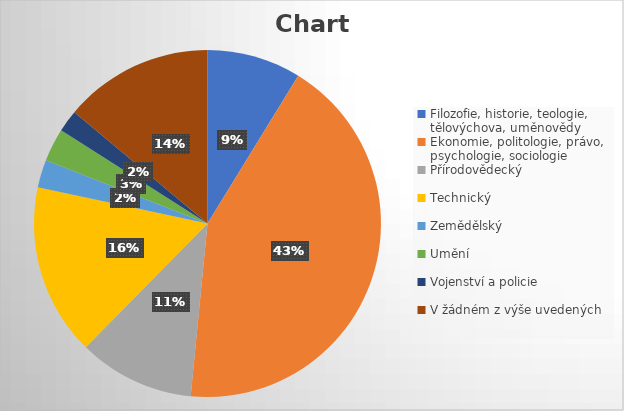
| Category | Series 0 |
|---|---|
| Filozofie, historie, teologie, tělovýchova, uměnovědy | 17 |
| Ekonomie, politologie, právo, psychologie, sociologie | 83 |
| Přírodovědecký | 21 |
| Technický | 31 |
| Zemědělský | 5 |
| Umění | 6 |
| Vojenství a policie | 4 |
| V žádném z výše uvedených | 27 |